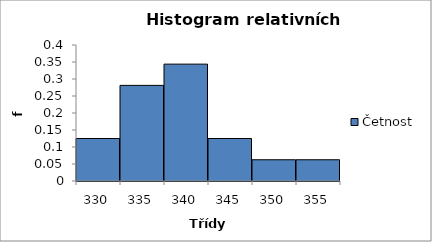
| Category | Četnost |
|---|---|
| 330.0 | 0.125 |
| 335.0 | 0.281 |
| 340.0 | 0.344 |
| 345.0 | 0.125 |
| 350.0 | 0.062 |
| 355.0 | 0.062 |